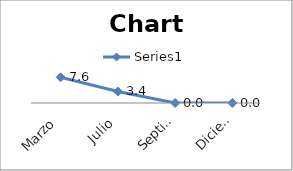
| Category | Series 0 |
|---|---|
| Marzo | 7.614 |
| Julio | 3.409 |
| Septiembre | 0 |
| Diciembre | 0 |